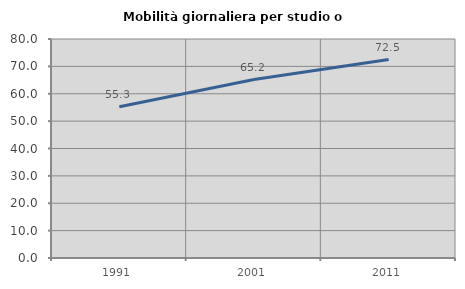
| Category | Mobilità giornaliera per studio o lavoro |
|---|---|
| 1991.0 | 55.276 |
| 2001.0 | 65.199 |
| 2011.0 | 72.498 |